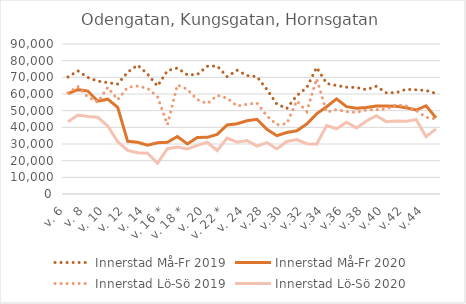
| Category | Innerstad |
|---|---|
| v. 6 | 43337 |
| v. 7 | 47346.5 |
| v. 8 | 46545.5 |
| v. 9 | 46045 |
| v. 10 | 40768.5 |
| v. 11 | 31353 |
| v. 12 | 26107.5 |
| v. 13 | 24793.5 |
| v. 14 | 24435 |
| v. 15 * | 18552.92 |
| v. 16 * | 27165.801 |
| v. 17 | 28228.906 |
| v. 18 * | 27031.313 |
| v. 19 | 29149.017 |
| v. 20 | 31042.668 |
| v. 21 * | 26093.879 |
| v. 22 * | 33517.139 |
| v. 23 | 31121.134 |
| v. 24 | 32123.378 |
| v.27 | 28758.043 |
| v.28 | 30863.132 |
| v.29 | 27050.811 |
| v.30 | 31535.976 |
| v.31 | 32694.816 |
| v.32 | 30200.489 |
| v.33 | 29884.265 |
| v.34 | 41128.354 |
| v.35 | 39133.96 |
| v.36 | 43089.926 |
| v.37 | 39655.752 |
| v.38 | 43828.592 |
| v.39 | 46977.922 |
| v.40 | 43410.013 |
| v.41 | 43811.466 |
| v.42 | 43590.597 |
| v.43 | 44740.196 |
| v.44 | 34283.841 |
| v.45 | 39037.458 |